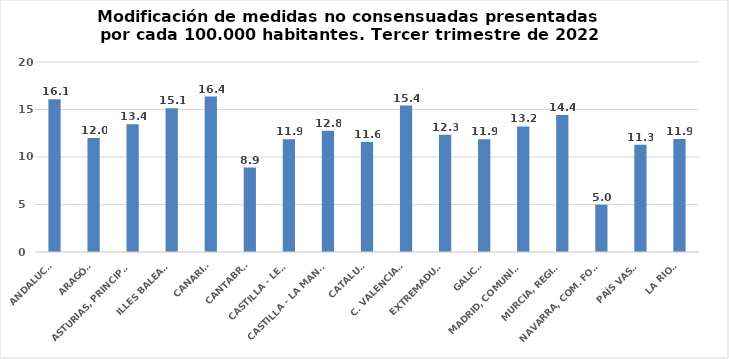
| Category | Series 0 |
|---|---|
| ANDALUCÍA | 16.082 |
| ARAGÓN | 11.997 |
| ASTURIAS, PRINCIPADO | 13.44 |
| ILLES BALEARS | 15.133 |
| CANARIAS | 16.357 |
| CANTABRIA | 8.886 |
| CASTILLA - LEÓN | 11.856 |
| CASTILLA - LA MANCHA | 12.767 |
| CATALUÑA | 11.589 |
| C. VALENCIANA | 15.42 |
| EXTREMADURA | 12.331 |
| GALICIA | 11.862 |
| MADRID, COMUNIDAD | 13.211 |
| MURCIA, REGIÓN | 14.431 |
| NAVARRA, COM. FORAL | 4.973 |
| PAÍS VASCO | 11.281 |
| LA RIOJA | 11.894 |